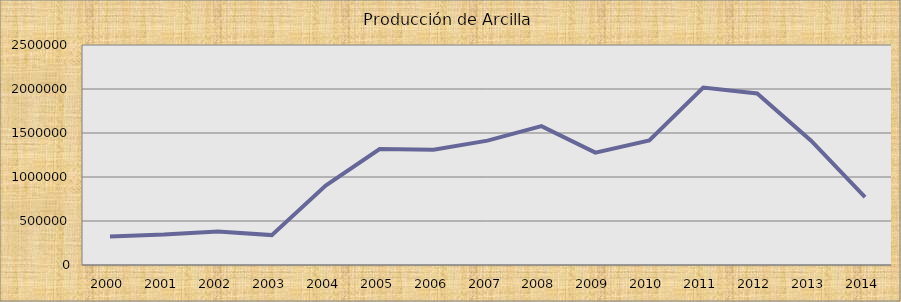
| Category | Series 0 |
|---|---|
| 2000.0 | 324671.2 |
| 2001.0 | 345474.13 |
| 2002.0 | 381872.53 |
| 2003.0 | 339566.64 |
| 2004.0 | 902517.89 |
| 2005.0 | 1318356.13 |
| 2006.0 | 1309343.06 |
| 2007.0 | 1413418.92 |
| 2008.0 | 1577932.61 |
| 2009.0 | 1276529.28 |
| 2010.0 | 1414852.68 |
| 2011.0 | 2016027 |
| 2012.0 | 1949509.49 |
| 2013.0 | 1412989.66 |
| 2014.0 | 770936.72 |